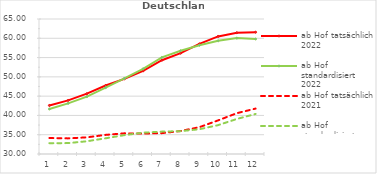
| Category | ab Hof tatsächlich 2022 | ab Hof standardisiert 2022 | ab Hof tatsächlich 2021 | ab Hof standardisiert 2021 |
|---|---|---|---|---|
| 0 | 42.587 | 41.66 | 34.142 | 32.806 |
| 1 | 43.895 | 43.126 | 34.048 | 32.821 |
| 2 | 45.64 | 44.862 | 34.318 | 33.303 |
| 3 | 47.747 | 47.202 | 34.958 | 34.074 |
| 4 | 49.489 | 49.591 | 35.359 | 34.893 |
| 5 | 51.558 | 52.084 | 35.284 | 35.525 |
| 6 | 54.321 | 55.039 | 35.404 | 35.805 |
| 7 | 56.139 | 56.771 | 35.959 | 35.927 |
| 8 | 58.54 | 58.188 | 36.953 | 36.421 |
| 9 | 60.483 | 59.335 | 38.716 | 37.483 |
| 10 | 61.442 | 60.044 | 40.586 | 39.088 |
| 11 | 61.58 | 59.812 | 41.776 | 40.381 |